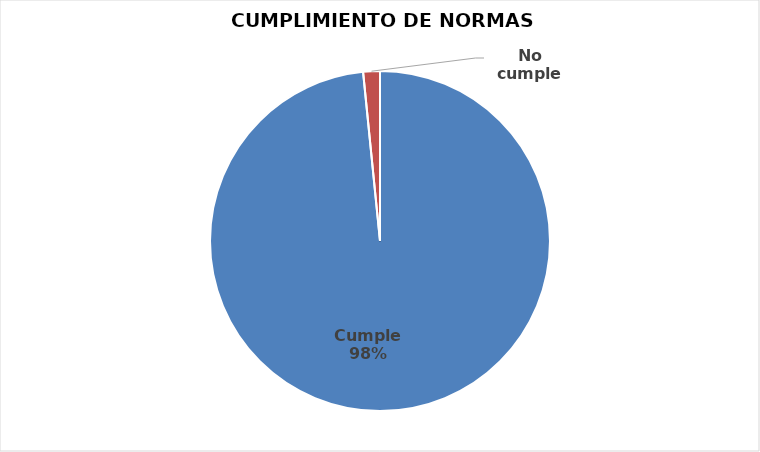
| Category | Series 0 |
|---|---|
| Cumple | 186 |
| No cumple | 3 |